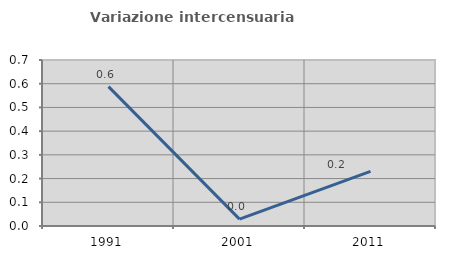
| Category | Variazione intercensuaria annua |
|---|---|
| 1991.0 | 0.588 |
| 2001.0 | 0.029 |
| 2011.0 | 0.23 |